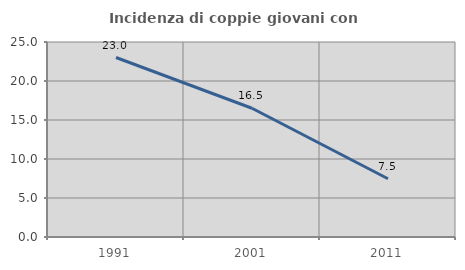
| Category | Incidenza di coppie giovani con figli |
|---|---|
| 1991.0 | 23.01 |
| 2001.0 | 16.508 |
| 2011.0 | 7.469 |